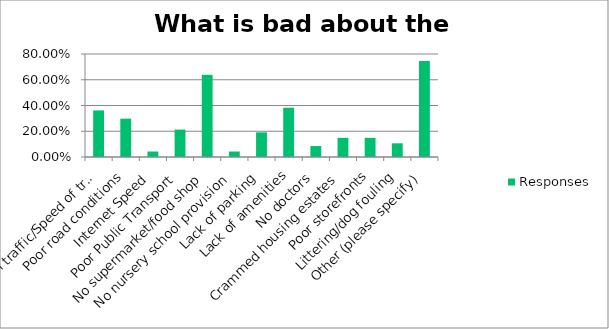
| Category | Responses |
|---|---|
| Too much traffic/Speed of traffic/traffic pollution | 0.362 |
| Poor road conditions | 0.298 |
| Internet Speed | 0.043 |
| Poor Public Transport | 0.213 |
| No supermarket/food shop | 0.638 |
| No nursery school provision | 0.043 |
| Lack of parking | 0.192 |
| Lack of amenities | 0.383 |
| No doctors | 0.085 |
| Crammed housing estates | 0.149 |
| Poor storefronts | 0.149 |
| Littering/dog fouling | 0.106 |
| Other (please specify) | 0.745 |